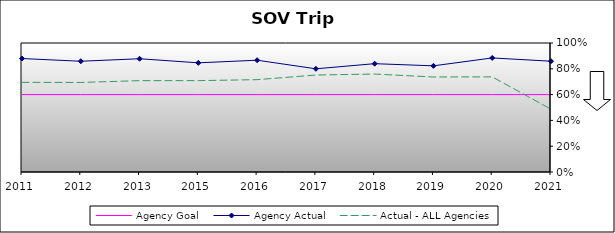
| Category | Agency Goal | Agency Actual | Actual - ALL Agencies |
|---|---|---|---|
| 2011.0 | 0.6 | 0.88 | 0.695 |
| 2012.0 | 0.6 | 0.858 | 0.694 |
| 2013.0 | 0.6 | 0.878 | 0.708 |
| 2015.0 | 0.6 | 0.846 | 0.708 |
| 2016.0 | 0.6 | 0.867 | 0.716 |
| 2017.0 | 0.6 | 0.8 | 0.752 |
| 2018.0 | 0.6 | 0.84 | 0.759 |
| 2019.0 | 0.6 | 0.823 | 0.736 |
| 2020.0 | 0.6 | 0.884 | 0.737 |
| 2021.0 | 0.6 | 0.859 | 0.487 |